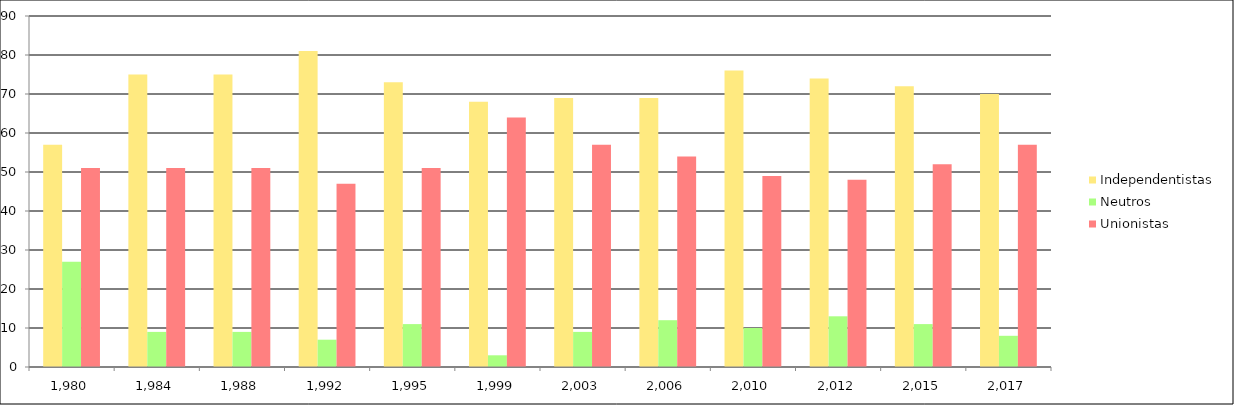
| Category | Independentistas | Neutros | Unionistas |
|---|---|---|---|
| 1980.0 | 57 | 27 | 51 |
| 1984.0 | 75 | 9 | 51 |
| 1988.0 | 75 | 9 | 51 |
| 1992.0 | 81 | 7 | 47 |
| 1995.0 | 73 | 11 | 51 |
| 1999.0 | 68 | 3 | 64 |
| 2003.0 | 69 | 9 | 57 |
| 2006.0 | 69 | 12 | 54 |
| 2010.0 | 76 | 10 | 49 |
| 2012.0 | 74 | 13 | 48 |
| 2015.0 | 72 | 11 | 52 |
| 2017.0 | 70 | 8 | 57 |